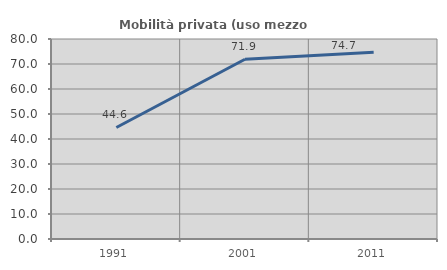
| Category | Mobilità privata (uso mezzo privato) |
|---|---|
| 1991.0 | 44.601 |
| 2001.0 | 71.905 |
| 2011.0 | 74.667 |